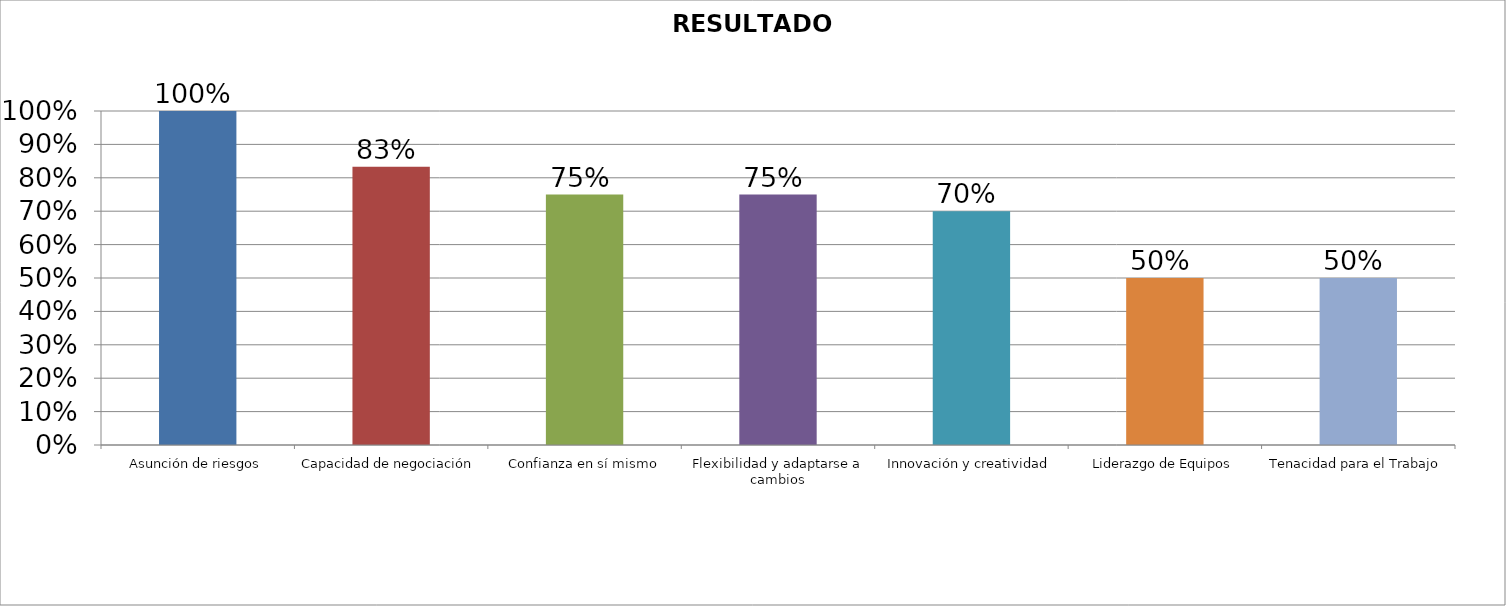
| Category | Concepto |
|---|---|
| Asunción de riesgos | 1 |
| Capacidad de negociación | 0.833 |
| Confianza en sí mismo | 0.75 |
| Flexibilidad y adaptarse a cambios | 0.75 |
| Innovación y creatividad | 0.7 |
| Liderazgo de Equipos | 0.5 |
| Tenacidad para el Trabajo | 0.5 |